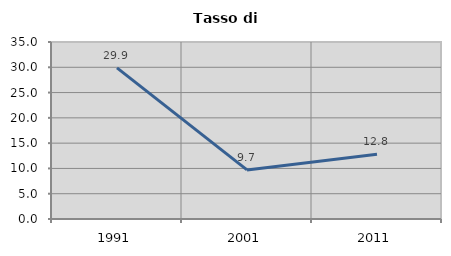
| Category | Tasso di disoccupazione   |
|---|---|
| 1991.0 | 29.891 |
| 2001.0 | 9.711 |
| 2011.0 | 12.789 |